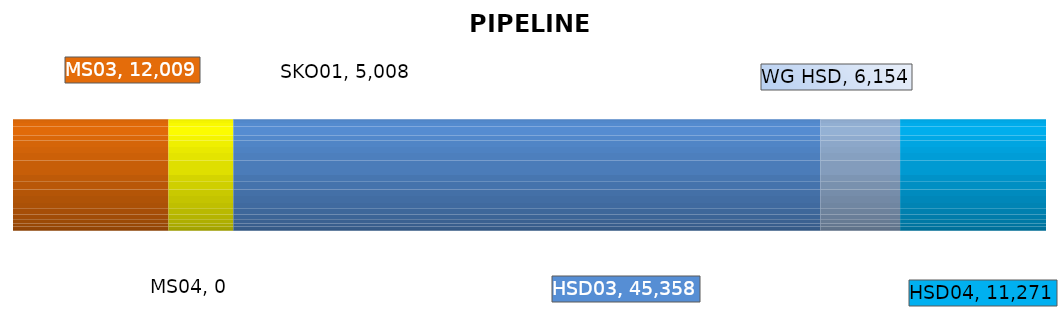
| Category | MS03 | MS04 | SKO01 | HSD03 | WG HSD | HSD04 |
|---|---|---|---|---|---|---|
| 0 | 12009 | 0 | 5008 | 45358 | 6154 | 11271 |